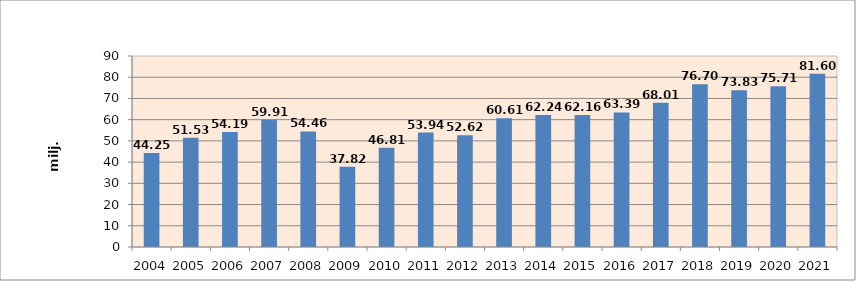
| Category | Series 0 |
|---|---|
| 2004.0 | 44.25 |
| 2005.0 | 51.53 |
| 2006.0 | 54.19 |
| 2007.0 | 59.91 |
| 2008.0 | 54.46 |
| 2009.0 | 37.82 |
| 2010.0 | 46.81 |
| 2011.0 | 53.94 |
| 2012.0 | 52.62 |
| 2013.0 | 60.61 |
| 2014.0 | 62.24 |
| 2015.0 | 62.16 |
| 2016.0 | 63.388 |
| 2017.0 | 68.01 |
| 2018.0 | 76.7 |
| 2019.0 | 73.83 |
| 2020.0 | 75.71 |
| 2021.0 | 81.6 |